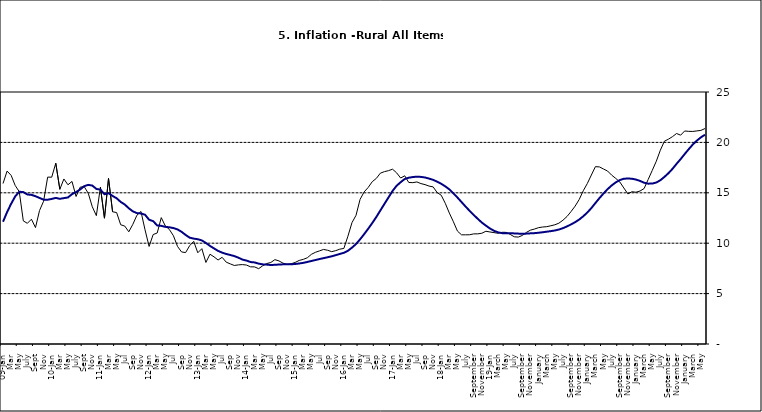
| Category | Series 0 | Series 1 |
|---|---|---|
| 09-Jan | 15.918 | 12.128 |
| Feb | 17.154 | 13.086 |
| Mar | 16.729 | 13.912 |
| Apr | 15.727 | 14.644 |
| May | 15.113 | 15.104 |
| June | 12.213 | 15.067 |
| July | 11.974 | 14.832 |
| Aug | 12.38 | 14.796 |
| Sept | 11.548 | 14.661 |
| Oct | 13.242 | 14.488 |
| Nov | 14.164 | 14.321 |
|  | 16.557 | 14.316 |
| 10-Jan | 16.548 | 14.39 |
| Feb | 17.934 | 14.494 |
| Mar | 15.346 | 14.401 |
| Apr | 16.373 | 14.473 |
| May | 15.794 | 14.54 |
| June | 16.126 | 14.862 |
| July | 14.634 | 15.072 |
| Aug | 15.556 | 15.33 |
| Sept | 15.616 | 15.658 |
| Oct | 14.955 | 15.786 |
| Nov | 13.616 | 15.719 |
| Dec | 12.735 | 15.385 |
| 11-Jan | 15.553 | 15.311 |
| Feb | 12.482 | 14.856 |
| Mar | 16.422 | 14.956 |
| Apr | 13.117 | 14.687 |
| May | 13.041 | 14.457 |
| Jun | 11.83 | 14.095 |
| Jul | 11.699 | 13.84 |
| Aug | 11.13 | 13.464 |
| Sep | 11.878 | 13.156 |
| Oct | 12.778 | 12.985 |
| Nov | 13.147 | 12.95 |
| Dec | 11.326 | 12.824 |
| 12-Jan | 9.678 | 12.33 |
| Feb | 10.856 | 12.188 |
| Mar | 11.014 | 11.76 |
| Apr | 12.536 | 11.724 |
| May | 11.712 | 11.621 |
| Jun | 11.36 | 11.582 |
| Jul | 10.733 | 11.499 |
| Aug | 9.683 | 11.368 |
| Sep | 9.132 | 11.131 |
| Oct | 9.071 | 10.82 |
| Nov | 9.758 | 10.548 |
| Dec | 10.183 | 10.455 |
| 13-Jan | 9.052 | 10.394 |
| Feb | 9.457 | 10.276 |
| Mar | 8.091 | 10.025 |
| Apr | 8.907 | 9.732 |
| May | 8.647 | 9.483 |
| Jun | 8.333 | 9.236 |
| Jul | 8.6 | 9.063 |
| Aug | 8.12 | 8.933 |
| Sep | 7.95 | 8.832 |
| Oct | 7.791 | 8.722 |
| Nov | 7.849 | 8.565 |
| Dec | 7.879 | 8.378 |
| 14-Jan | 7.832 | 8.277 |
| Feb | 7.657 | 8.13 |
| Mar | 7.65 | 8.092 |
| Apr | 7.473 | 7.973 |
| May | 7.761 | 7.901 |
| Jun | 7.98 | 7.874 |
| Jul | 8.086 | 7.834 |
| Aug | 8.368 | 7.858 |
| Sep | 8.244 | 7.883 |
| Oct | 8.019 | 7.903 |
| Nov | 7.898 | 7.906 |
| Dec | 7.955 | 7.913 |
| 15-Jan | 8.094 | 7.935 |
| Feb | 8.291 | 7.988 |
| Mar | 8.396 | 8.05 |
| Apr | 8.556 | 8.14 |
| May | 8.896 | 8.236 |
| Jun | 9.098 | 8.331 |
| Jul | 9.238 | 8.429 |
| Aug | 9.382 | 8.516 |
| Sep | 9.3 | 8.606 |
| Oct | 9.162 | 8.7 |
| Nov | 9.261 | 8.813 |
| Dec | 9.41 | 8.933 |
| 16-Jan | 9.48 | 9.047 |
| Feb | 10.692 | 9.249 |
| Mar | 12.038 | 9.559 |
| Apr | 12.767 | 9.917 |
| May | 14.349 | 10.384 |
| Jun | 15.088 | 10.897 |
| Jul | 15.533 | 11.433 |
| Aug | 16.103 | 12.002 |
| Sep | 16.428 | 12.601 |
| Oct | 16.947 | 13.25 |
| Nov | 17.099 | 13.898 |
| Dec | 17.195 | 14.54 |
| 17-Jan | 17.341 | 15.183 |
| Feb | 16.982 | 15.696 |
| Mar | 16.466 | 16.054 |
| Apr | 16.687 | 16.369 |
| May | 16.023 | 16.497 |
| Jun | 16.007 | 16.563 |
| Jul | 16.078 | 16.6 |
| Aug | 15.914 | 16.577 |
| Sep | 15.812 | 16.52 |
| Oct | 15.666 | 16.411 |
| Nov | 15.587 | 16.285 |
| Dec | 15.018 | 16.104 |
| 18-Jan | 14.756 | 15.892 |
| Feb | 13.957 | 15.638 |
| Mar | 12.987 | 15.339 |
| Apr | 12.126 | 14.95 |
| May | 11.199 | 14.53 |
| June | 10.832 | 14.083 |
| July | 10.831 | 13.636 |
| August | 10.838 | 13.209 |
| September | 10.924 | 12.804 |
| October | 10.927 | 12.418 |
| November | 10.986 | 12.049 |
| December | 11.183 | 11.746 |
| 19-Jan | 11.115 | 11.462 |
| February | 11.048 | 11.234 |
| March | 10.99 | 11.078 |
| April | 11.08 | 10.997 |
| May | 11.075 | 10.988 |
| June | 10.874 | 10.99 |
| July | 10.636 | 10.972 |
| August | 10.609 | 10.951 |
| September | 10.771 | 10.937 |
| October | 11.074 | 10.95 |
| November | 11.296 | 10.977 |
| December | 11.406 | 10.998 |
| January | 11.543 | 11.037 |
| February | 11.606 | 11.086 |
| March | 11.639 | 11.141 |
| April | 11.728 | 11.197 |
| May | 11.826 | 11.261 |
| June | 11.988 | 11.355 |
| July | 12.28 | 11.493 |
| August | 12.651 | 11.664 |
| September | 13.14 | 11.864 |
| October | 13.68 | 12.086 |
| November | 14.335 | 12.346 |
| December | 15.2 | 12.67 |
| January | 15.918 | 13.043 |
| February | 16.766 | 13.482 |
| March | 17.596 | 13.985 |
| April | 17.566 | 14.475 |
| May | 17.358 | 14.935 |
| June | 17.159 | 15.362 |
| July | 16.753 | 15.726 |
| August | 16.433 | 16.03 |
| September | 16.081 | 16.26 |
| October | 15.48 | 16.393 |
| November | 14.89 | 16.419 |
| December | 15.106 | 16.397 |
| January | 15.055 | 16.313 |
| February | 15.179 | 16.176 |
| March | 15.421 | 15.999 |
| April | 16.321 | 15.908 |
| May | 17.215 | 15.915 |
| June | 18.128 | 16.017 |
| July | 19.224 | 16.246 |
| August | 20.118 | 16.575 |
| September | 20.322 | 16.944 |
| October | 20.572 | 17.376 |
| November | 20.882 | 17.876 |
| December | 20.718 | 18.342 |
| January | 21.134 | 18.844 |
| February | 21.096 | 19.329 |
| March | 21.088 | 19.79 |
| April | 21.138 | 20.18 |
| May | 21.19 | 20.501 |
| June | 21.373 | 20.762 |